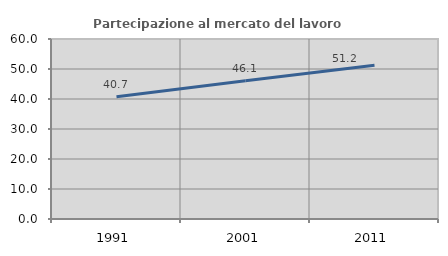
| Category | Partecipazione al mercato del lavoro  femminile |
|---|---|
| 1991.0 | 40.747 |
| 2001.0 | 46.057 |
| 2011.0 | 51.241 |